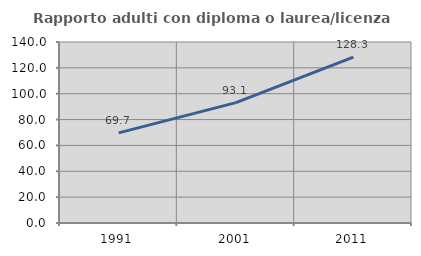
| Category | Rapporto adulti con diploma o laurea/licenza media  |
|---|---|
| 1991.0 | 69.726 |
| 2001.0 | 93.137 |
| 2011.0 | 128.28 |